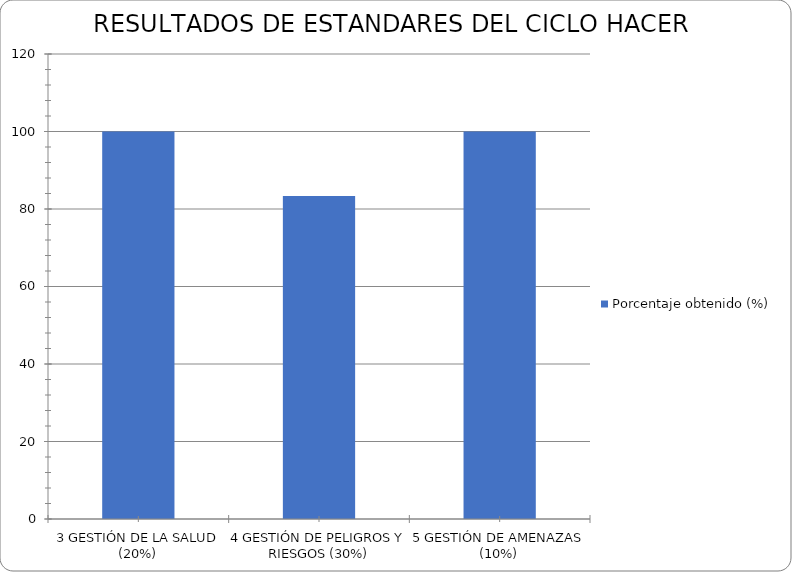
| Category | Porcentaje obtenido (%) |
|---|---|
| 3 GESTIÓN DE LA SALUD (20%) | 100 |
| 4 GESTIÓN DE PELIGROS Y RIESGOS (30%) | 83.33 |
| 5 GESTIÓN DE AMENAZAS (10%) | 100 |